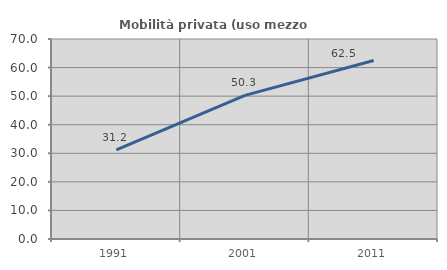
| Category | Mobilità privata (uso mezzo privato) |
|---|---|
| 1991.0 | 31.203 |
| 2001.0 | 50.279 |
| 2011.0 | 62.476 |